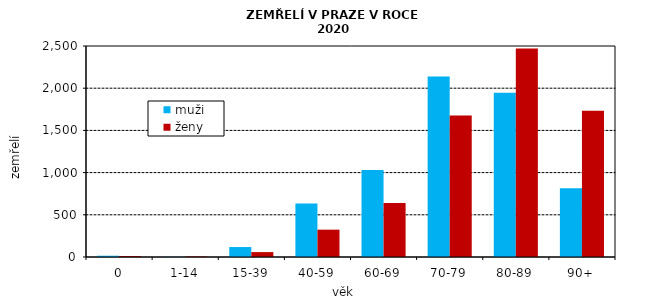
| Category | muži | ženy |
|---|---|---|
| 0 | 15 | 11 |
| 1-14 | 2 | 6 |
| 15-39 | 118 | 58 |
| 40-59 | 634 | 324 |
| 60-69 | 1030 | 640 |
| 70-79 | 2140 | 1678 |
| 80-89 | 1947 | 2469 |
| 90+ | 815 | 1734 |